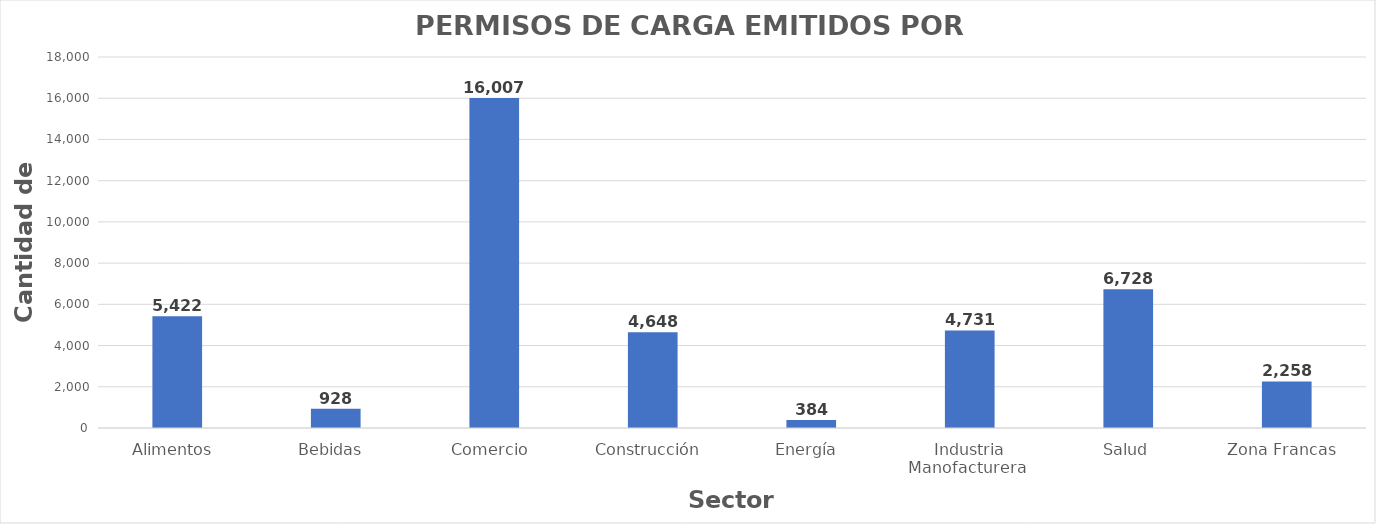
| Category | Series 0 |
|---|---|
| Alimentos  | 5422 |
| Bebidas  | 928 |
| Comercio  | 16007 |
| Construcción  | 4648 |
| Energía  | 384 |
| Industria Manofacturera  | 4731 |
| Salud | 6728 |
| Zona Francas  | 2258 |